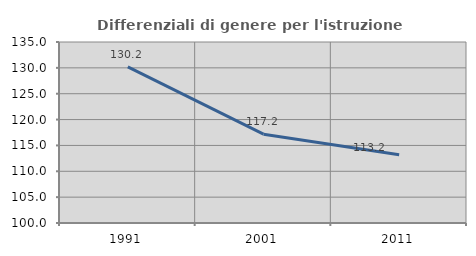
| Category | Differenziali di genere per l'istruzione superiore |
|---|---|
| 1991.0 | 130.174 |
| 2001.0 | 117.174 |
| 2011.0 | 113.199 |